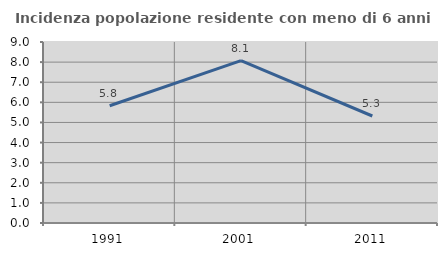
| Category | Incidenza popolazione residente con meno di 6 anni |
|---|---|
| 1991.0 | 5.83 |
| 2001.0 | 8.071 |
| 2011.0 | 5.321 |